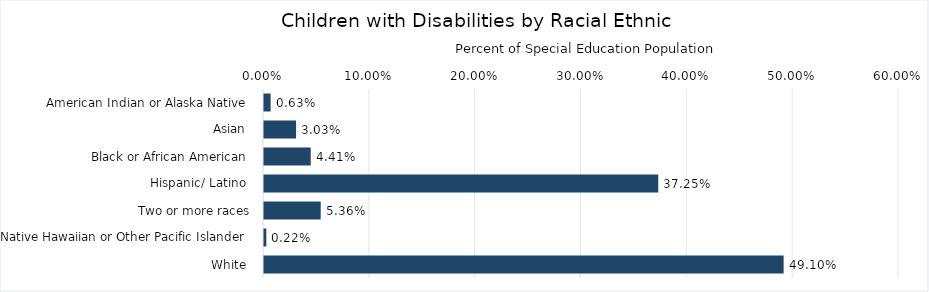
| Category | Percentage |
|---|---|
| American Indian or Alaska Native  | 0.006 |
| Asian  | 0.03 |
| Black or African American  | 0.044 |
| Hispanic/ Latino  | 0.373 |
| Two or more races | 0.054 |
| Native Hawaiian or Other Pacific Islander  | 0.002 |
| White  | 0.491 |